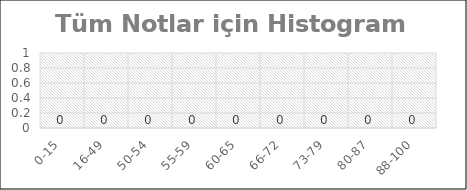
| Category | Öğrenci Sayısı |
|---|---|
| 0-15 | 0 |
| 16-49 | 0 |
| 50-54 | 0 |
| 55-59 | 0 |
| 60-65 | 0 |
| 66-72 | 0 |
| 73-79 | 0 |
| 80-87 | 0 |
| 88-100 | 0 |